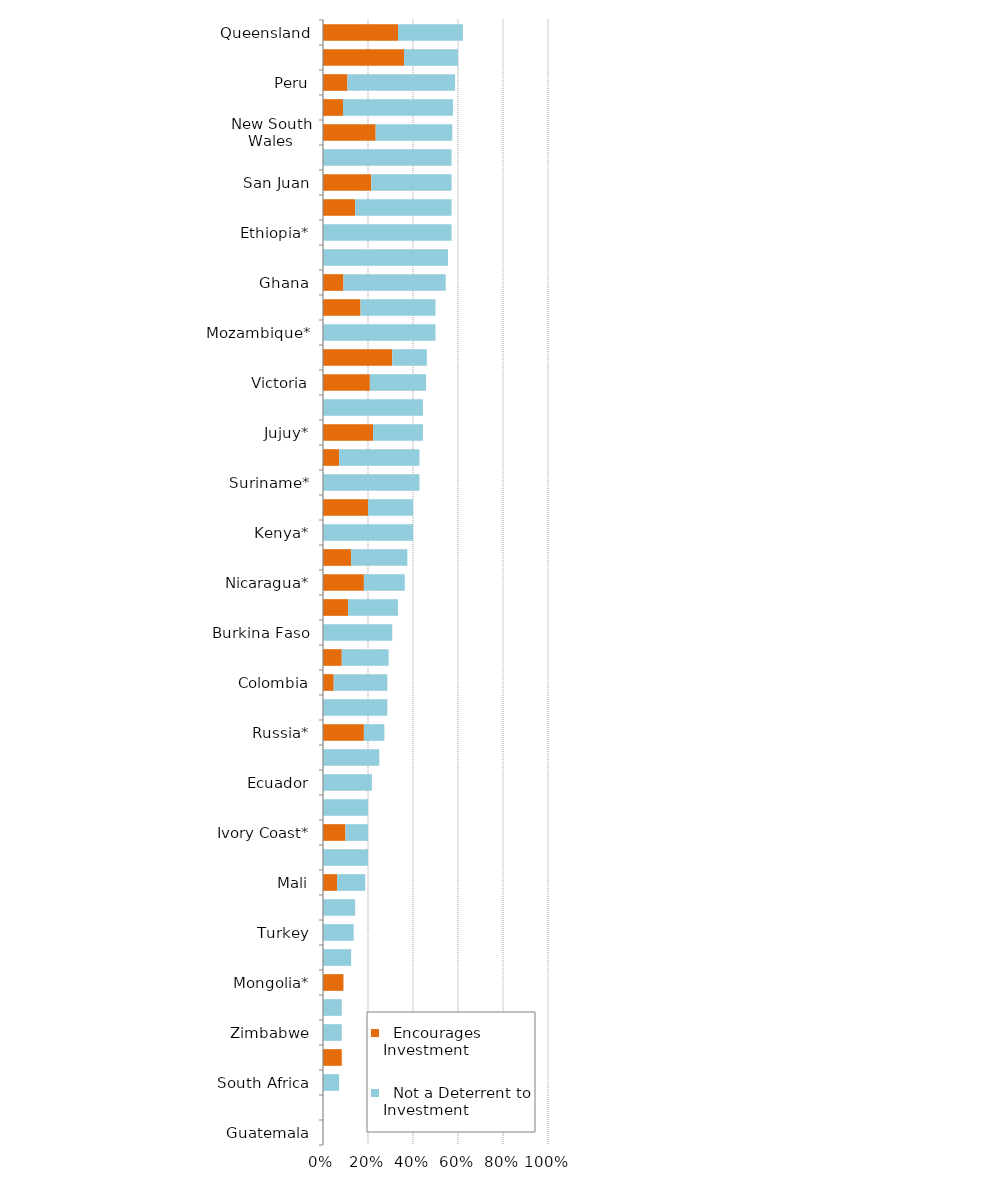
| Category |   Encourages Investment |   Not a Deterrent to Investment |
|---|---|---|
| Guatemala | 0 | 0 |
| Venezuela | 0 | 0 |
| South Africa | 0 | 0.071 |
| Democratic Republic of Congo (DRC) | 0.083 | 0 |
| Zimbabwe | 0 | 0.083 |
| Bolivia | 0 | 0.083 |
| Mongolia* | 0.091 | 0 |
| Indonesia | 0 | 0.125 |
| Turkey | 0 | 0.136 |
| Romania* | 0 | 0.143 |
| Mali | 0.062 | 0.125 |
| Papua New Guinea | 0 | 0.2 |
| Ivory Coast* | 0.1 | 0.1 |
| Zambia | 0 | 0.2 |
| Ecuador | 0 | 0.217 |
| Tanzania | 0 | 0.25 |
| Russia* | 0.182 | 0.091 |
| Philippines* | 0 | 0.286 |
| Colombia | 0.048 | 0.238 |
| Brazil | 0.083 | 0.208 |
| Burkina Faso | 0 | 0.308 |
| Chubut* | 0.111 | 0.222 |
| Nicaragua* | 0.182 | 0.182 |
| Panama* | 0.125 | 0.25 |
| Kenya* | 0 | 0.4 |
| Mendoza | 0.2 | 0.2 |
| Suriname* | 0 | 0.429 |
| Santa Cruz | 0.071 | 0.357 |
| Jujuy* | 0.222 | 0.222 |
| China* | 0 | 0.444 |
| Victoria | 0.208 | 0.25 |
| Fiji | 0.308 | 0.154 |
| Mozambique* | 0 | 0.5 |
| La Rioja* | 0.167 | 0.333 |
| Ghana | 0.091 | 0.455 |
| Dominican Republic* | 0 | 0.556 |
| Ethiopia* | 0 | 0.571 |
| Catamarca* | 0.143 | 0.429 |
| San Juan | 0.214 | 0.357 |
| Guyana* | 0 | 0.571 |
| New South Wales | 0.234 | 0.34 |
| Mexico | 0.089 | 0.489 |
| Peru | 0.109 | 0.478 |
| Greenland | 0.36 | 0.24 |
| Queensland | 0.333 | 0.289 |